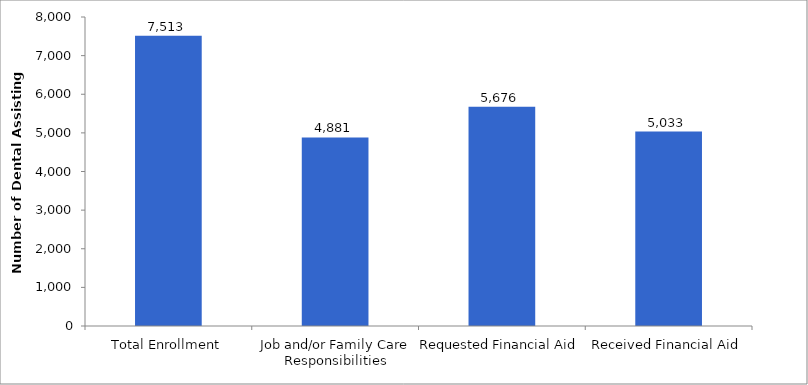
| Category | Series 0 |
|---|---|
| Total Enrollment | 7513 |
| Job and/or Family Care Responsibilities | 4881 |
| Requested Financial Aid | 5676 |
| Received Financial Aid | 5033 |